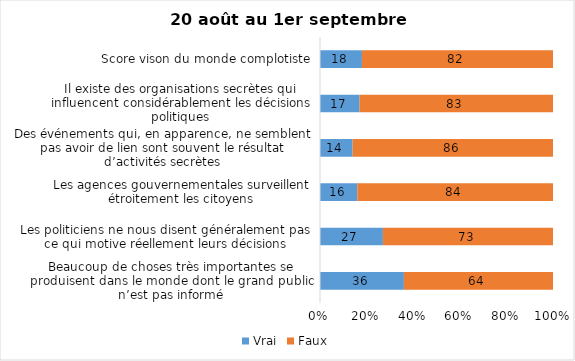
| Category | Vrai | Faux |
|---|---|---|
| Beaucoup de choses très importantes se produisent dans le monde dont le grand public n’est pas informé | 36 | 64 |
| Les politiciens ne nous disent généralement pas ce qui motive réellement leurs décisions | 27 | 73 |
| Les agences gouvernementales surveillent étroitement les citoyens | 16 | 84 |
| Des événements qui, en apparence, ne semblent pas avoir de lien sont souvent le résultat d’activités secrètes | 14 | 86 |
| Il existe des organisations secrètes qui influencent considérablement les décisions politiques | 17 | 83 |
| Score vison du monde complotiste | 18 | 82 |